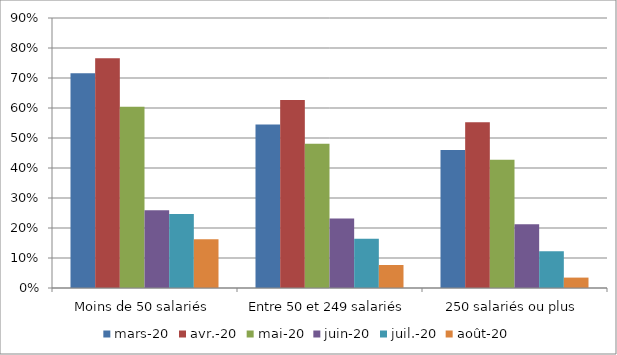
| Category | mars-20 | avr.-20 | mai-20 | juin-20 | juil.-20 | août-20 |
|---|---|---|---|---|---|---|
| Moins de 50 salariés | 0.716 | 0.765 | 0.605 | 0.259 | 0.247 | 0.163 |
| Entre 50 et 249 salariés | 0.545 | 0.627 | 0.481 | 0.231 | 0.165 | 0.077 |
| 250 salariés ou plus | 0.46 | 0.552 | 0.427 | 0.212 | 0.122 | 0.035 |